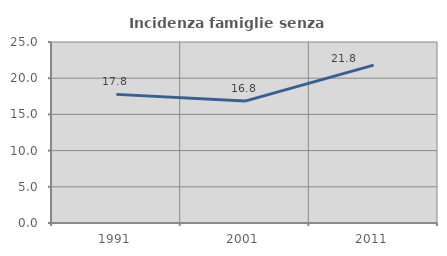
| Category | Incidenza famiglie senza nuclei |
|---|---|
| 1991.0 | 17.766 |
| 2001.0 | 16.836 |
| 2011.0 | 21.807 |